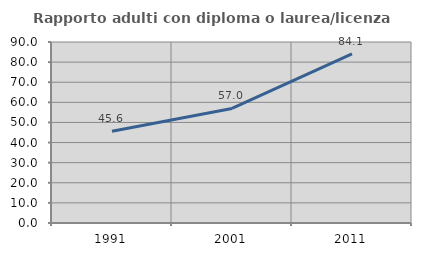
| Category | Rapporto adulti con diploma o laurea/licenza media  |
|---|---|
| 1991.0 | 45.64 |
| 2001.0 | 56.968 |
| 2011.0 | 84.146 |